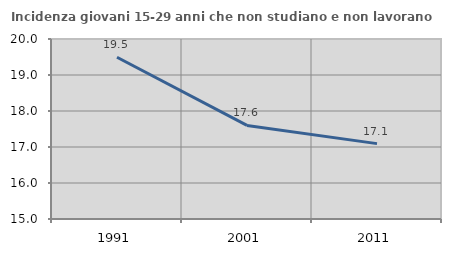
| Category | Incidenza giovani 15-29 anni che non studiano e non lavorano  |
|---|---|
| 1991.0 | 19.494 |
| 2001.0 | 17.6 |
| 2011.0 | 17.094 |